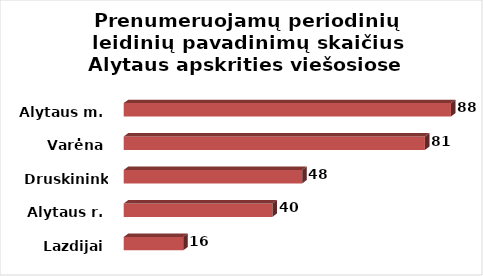
| Category | Series 0 |
|---|---|
| Lazdijai | 16 |
| Alytaus r. | 40 |
| Druskininkai | 48 |
| Varėna | 81 |
| Alytaus m. | 88 |